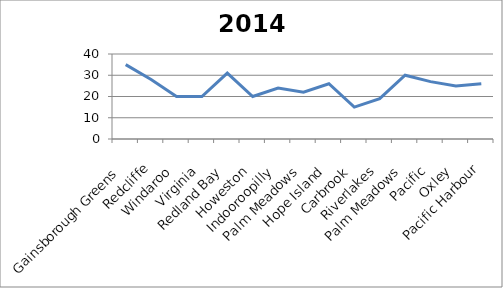
| Category | 2014 |
|---|---|
| Gainsborough Greens | 35 |
| Redcliffe | 28 |
| Windaroo | 20 |
| Virginia | 20 |
| Redland Bay | 31 |
| Howeston | 20 |
| Indooroopilly | 24 |
| Palm Meadows | 22 |
| Hope Island | 26 |
| Carbrook | 15 |
| Riverlakes | 19 |
| Palm Meadows | 30 |
| Pacific | 27 |
| Oxley | 25 |
| Pacific Harbour | 26 |